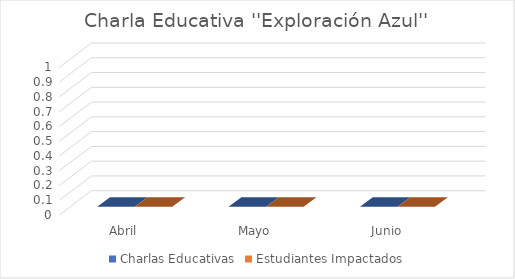
| Category | Charlas Educativas | Estudiantes Impactados |
|---|---|---|
| Abril | 0 | 0 |
| Mayo | 0 | 0 |
| Junio | 0 | 0 |